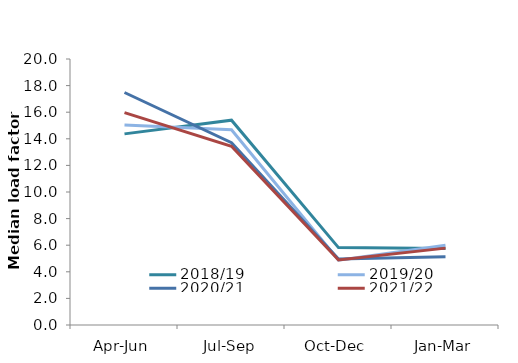
| Category | 2018/19 | 2019/20 | 2020/21 | 2021/22 |
|---|---|---|---|---|
| Apr-Jun | 14.37 | 15.04 | 17.48 | 15.97 |
| Jul-Sep | 15.4 | 14.68 | 13.71 | 13.44 |
| Oct-Dec | 5.82 | 4.87 | 4.97 | 4.89 |
| Jan-Mar | 5.76 | 6 | 5.13 | 5.78 |